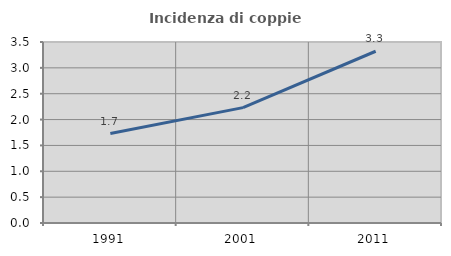
| Category | Incidenza di coppie miste |
|---|---|
| 1991.0 | 1.73 |
| 2001.0 | 2.23 |
| 2011.0 | 3.321 |